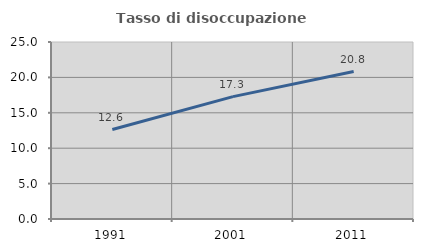
| Category | Tasso di disoccupazione giovanile  |
|---|---|
| 1991.0 | 12.637 |
| 2001.0 | 17.284 |
| 2011.0 | 20.833 |